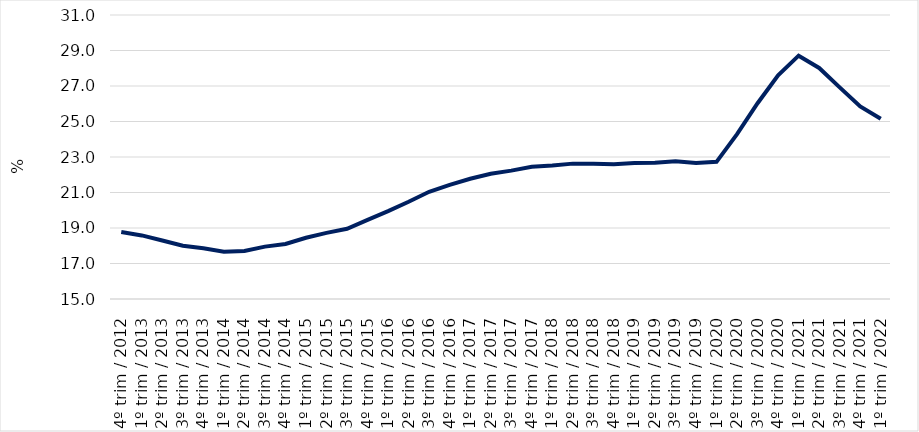
| Category | Series 0 |
|---|---|
| 4º trim / 2012 | 18.776 |
| 1º trim / 2013 | 18.583 |
| 2º trim / 2013 | 18.296 |
| 3º trim / 2013 | 18.003 |
| 4º trim / 2013 | 17.858 |
| 1º trim / 2014 | 17.666 |
| 2º trim / 2014 | 17.707 |
| 3º trim / 2014 | 17.952 |
| 4º trim / 2014 | 18.1 |
| 1º trim / 2015 | 18.452 |
| 2º trim / 2015 | 18.726 |
| 3º trim / 2015 | 18.954 |
| 4º trim / 2015 | 19.458 |
| 1º trim / 2016 | 19.953 |
| 2º trim / 2016 | 20.48 |
| 3º trim / 2016 | 21.042 |
| 4º trim / 2016 | 21.43 |
| 1º trim / 2017 | 21.777 |
| 2º trim / 2017 | 22.059 |
| 3º trim / 2017 | 22.231 |
| 4º trim / 2017 | 22.454 |
| 1º trim / 2018 | 22.516 |
| 2º trim / 2018 | 22.626 |
| 3º trim / 2018 | 22.625 |
| 4º trim / 2018 | 22.59 |
| 1º trim / 2019 | 22.663 |
| 2º trim / 2019 | 22.678 |
| 3º trim / 2019 | 22.762 |
| 4º trim / 2019 | 22.659 |
| 1º trim / 2020 | 22.727 |
| 2º trim / 2020 | 24.285 |
| 3º trim / 2020 | 26.029 |
| 4º trim / 2020 | 27.599 |
| 1º trim / 2021 | 28.708 |
| 2º trim / 2021 | 28.017 |
| 3º trim / 2021 | 26.924 |
| 4º trim / 2021 | 25.847 |
| 1º trim / 2022 | 25.152 |